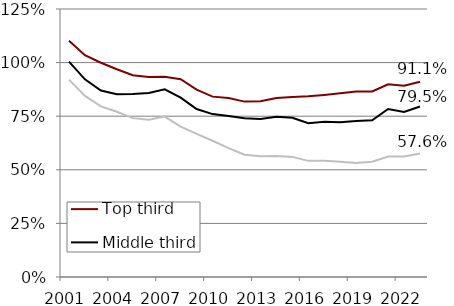
| Category | Top third | Middle third | Bottom third |
|---|---|---|---|
| 2001.0 | 1.102 | 1.004 | 0.921 |
| 2002.0 | 1.035 | 0.922 | 0.845 |
| 2003.0 | 0.999 | 0.869 | 0.796 |
| 2004.0 | 0.969 | 0.852 | 0.771 |
| 2005.0 | 0.941 | 0.853 | 0.741 |
| 2006.0 | 0.933 | 0.858 | 0.733 |
| 2007.0 | 0.934 | 0.875 | 0.748 |
| 2008.0 | 0.923 | 0.837 | 0.702 |
| 2009.0 | 0.874 | 0.783 | 0.668 |
| 2010.0 | 0.841 | 0.76 | 0.636 |
| 2011.0 | 0.835 | 0.751 | 0.601 |
| 2012.0 | 0.818 | 0.74 | 0.57 |
| 2013.0 | 0.82 | 0.737 | 0.564 |
| 2014.0 | 0.835 | 0.748 | 0.564 |
| 2015.0 | 0.84 | 0.742 | 0.56 |
| 2016.0 | 0.843 | 0.717 | 0.542 |
| 2017.0 | 0.849 | 0.724 | 0.542 |
| 2018.0 | 0.857 | 0.722 | 0.538 |
| 2019.0 | 0.865 | 0.727 | 0.532 |
| 2020.0 | 0.865 | 0.731 | 0.538 |
| 2021.0 | 0.899 | 0.784 | 0.562 |
| 2022.0 | 0.892 | 0.77 | 0.563 |
| 2023.0 | 0.911 | 0.795 | 0.576 |